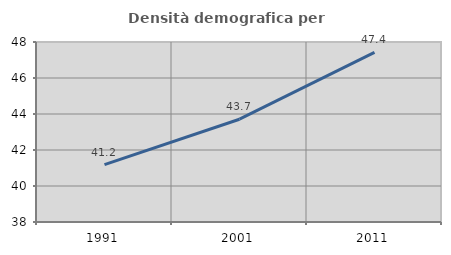
| Category | Densità demografica |
|---|---|
| 1991.0 | 41.189 |
| 2001.0 | 43.71 |
| 2011.0 | 47.423 |